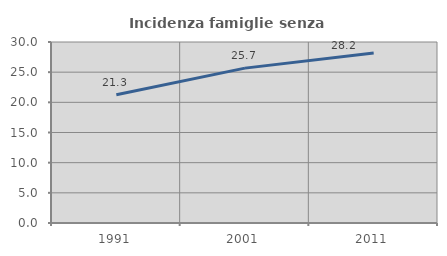
| Category | Incidenza famiglie senza nuclei |
|---|---|
| 1991.0 | 21.255 |
| 2001.0 | 25.671 |
| 2011.0 | 28.193 |